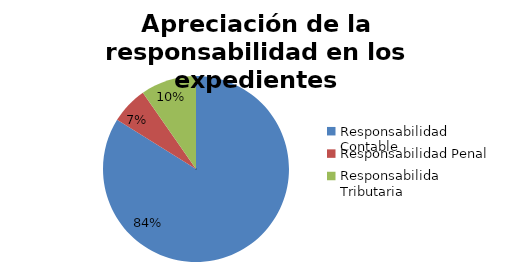
| Category | Series 0 |
|---|---|
| Responsabilidad Contable | 26 |
| Responsabilidad Penal | 2 |
| Responsabilida Tributaria | 3 |